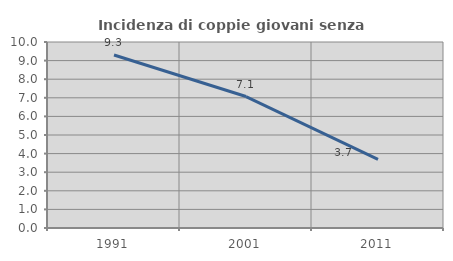
| Category | Incidenza di coppie giovani senza figli |
|---|---|
| 1991.0 | 9.301 |
| 2001.0 | 7.067 |
| 2011.0 | 3.686 |